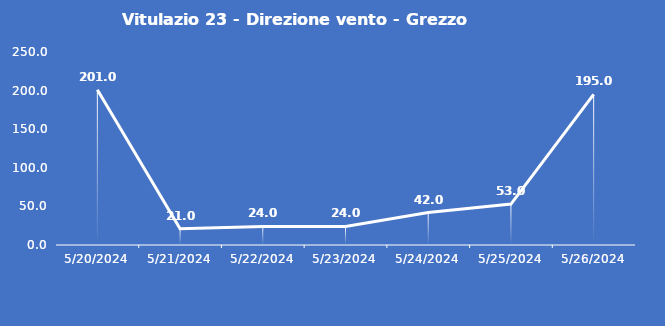
| Category | Vitulazio 23 - Direzione vento - Grezzo (°N) |
|---|---|
| 5/20/24 | 201 |
| 5/21/24 | 21 |
| 5/22/24 | 24 |
| 5/23/24 | 24 |
| 5/24/24 | 42 |
| 5/25/24 | 53 |
| 5/26/24 | 195 |